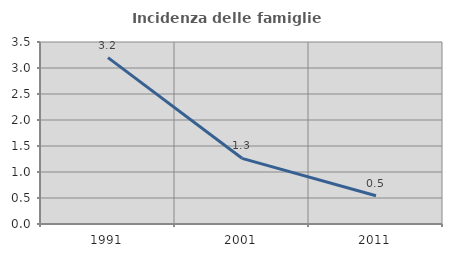
| Category | Incidenza delle famiglie numerose |
|---|---|
| 1991.0 | 3.199 |
| 2001.0 | 1.263 |
| 2011.0 | 0.542 |